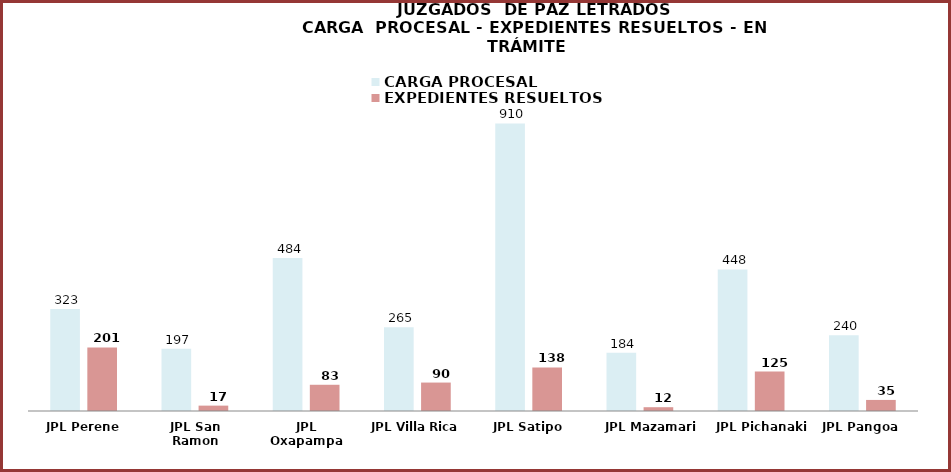
| Category | CARGA PROCESAL | EXPEDIENTES RESUELTOS |
|---|---|---|
| JPL Perene | 323 | 201 |
| JPL San Ramon | 197 | 17 |
| JPL Oxapampa | 484 | 83 |
| JPL Villa Rica | 265 | 90 |
| JPL Satipo | 910 | 138 |
| JPL Mazamari | 184 | 12 |
| JPL Pichanaki | 448 | 125 |
| JPL Pangoa | 240 | 35 |